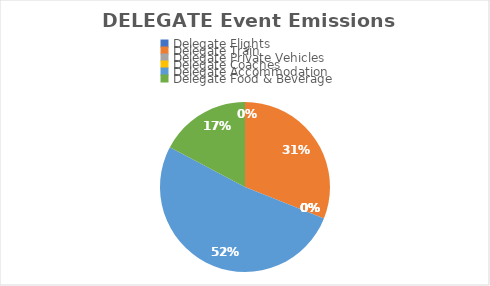
| Category | Series 0 |
|---|---|
| Delegate Flights | 0 |
| Delegate Train | 0.09 |
| Delegate Private Vehicles | 0 |
| Delegate Coaches | 0 |
| Delegate Accommodation | 0.15 |
| Delegate Food & Beverage | 0.05 |